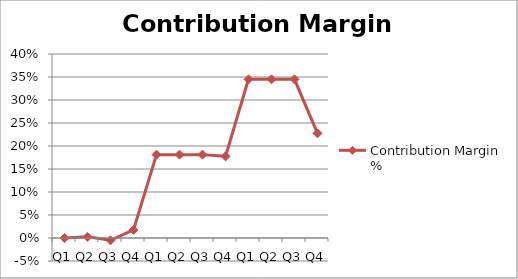
| Category | Contribution Margin % |
|---|---|
| Q1 | 0 |
| Q2 | 0.002 |
| Q3 | -0.005 |
| Q4 | 0.018 |
| Q1 | 0.181 |
| Q2 | 0.181 |
| Q3 | 0.181 |
| Q4 | 0.178 |
| Q1 | 0.345 |
| Q2 | 0.345 |
| Q3 | 0.345 |
| Q4 | 0.228 |